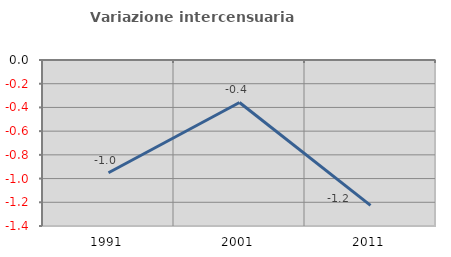
| Category | Variazione intercensuaria annua |
|---|---|
| 1991.0 | -0.951 |
| 2001.0 | -0.358 |
| 2011.0 | -1.227 |